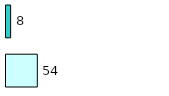
| Category | Series 0 | Series 1 |
|---|---|---|
| 0 | 54 | 8 |